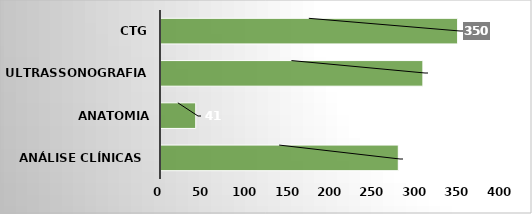
| Category | Series 0 |
|---|---|
| Análise Clínicas  | 280 |
| Anatomia Patológica | 41 |
| Ultrassonografia  | 309 |
| CTG | 350 |